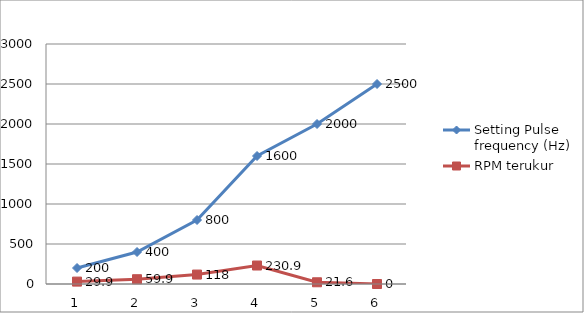
| Category | Setting Pulse frequency (Hz) | RPM terukur |
|---|---|---|
| 0 | 200 | 29.9 |
| 1 | 400 | 59.9 |
| 2 | 800 | 118 |
| 3 | 1600 | 230.9 |
| 4 | 2000 | 21.6 |
| 5 | 2500 | 0 |